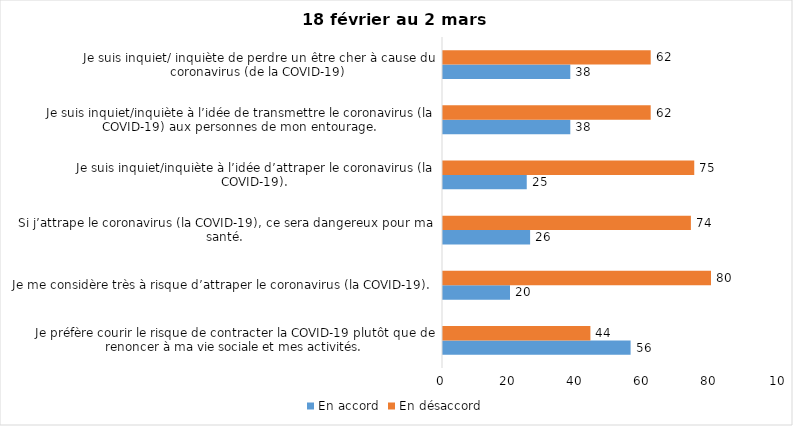
| Category | En accord | En désaccord |
|---|---|---|
| Je préfère courir le risque de contracter la COVID-19 plutôt que de renoncer à ma vie sociale et mes activités. | 56 | 44 |
| Je me considère très à risque d’attraper le coronavirus (la COVID-19). | 20 | 80 |
| Si j’attrape le coronavirus (la COVID-19), ce sera dangereux pour ma santé. | 26 | 74 |
| Je suis inquiet/inquiète à l’idée d’attraper le coronavirus (la COVID-19). | 25 | 75 |
| Je suis inquiet/inquiète à l’idée de transmettre le coronavirus (la COVID-19) aux personnes de mon entourage. | 38 | 62 |
| Je suis inquiet/ inquiète de perdre un être cher à cause du coronavirus (de la COVID-19) | 38 | 62 |